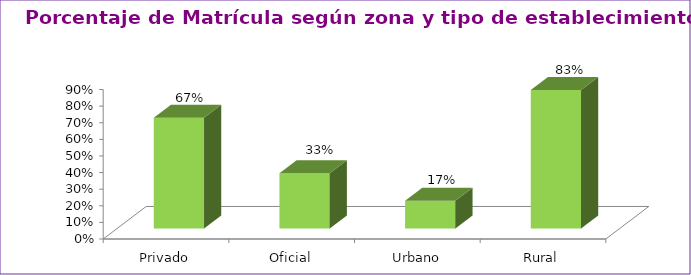
| Category | Series 1 |
|---|---|
| Privado | 0.667 |
| Oficial | 0.333 |
| Urbano | 0.167 |
| Rural | 0.833 |